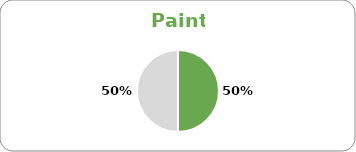
| Category | Series 0 |
|---|---|
| Sub-Total EPP | 1 |
| Sub-Total Non EPP | 1 |